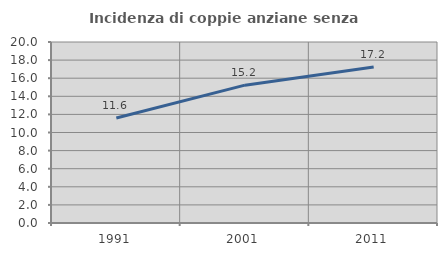
| Category | Incidenza di coppie anziane senza figli  |
|---|---|
| 1991.0 | 11.594 |
| 2001.0 | 15.23 |
| 2011.0 | 17.241 |